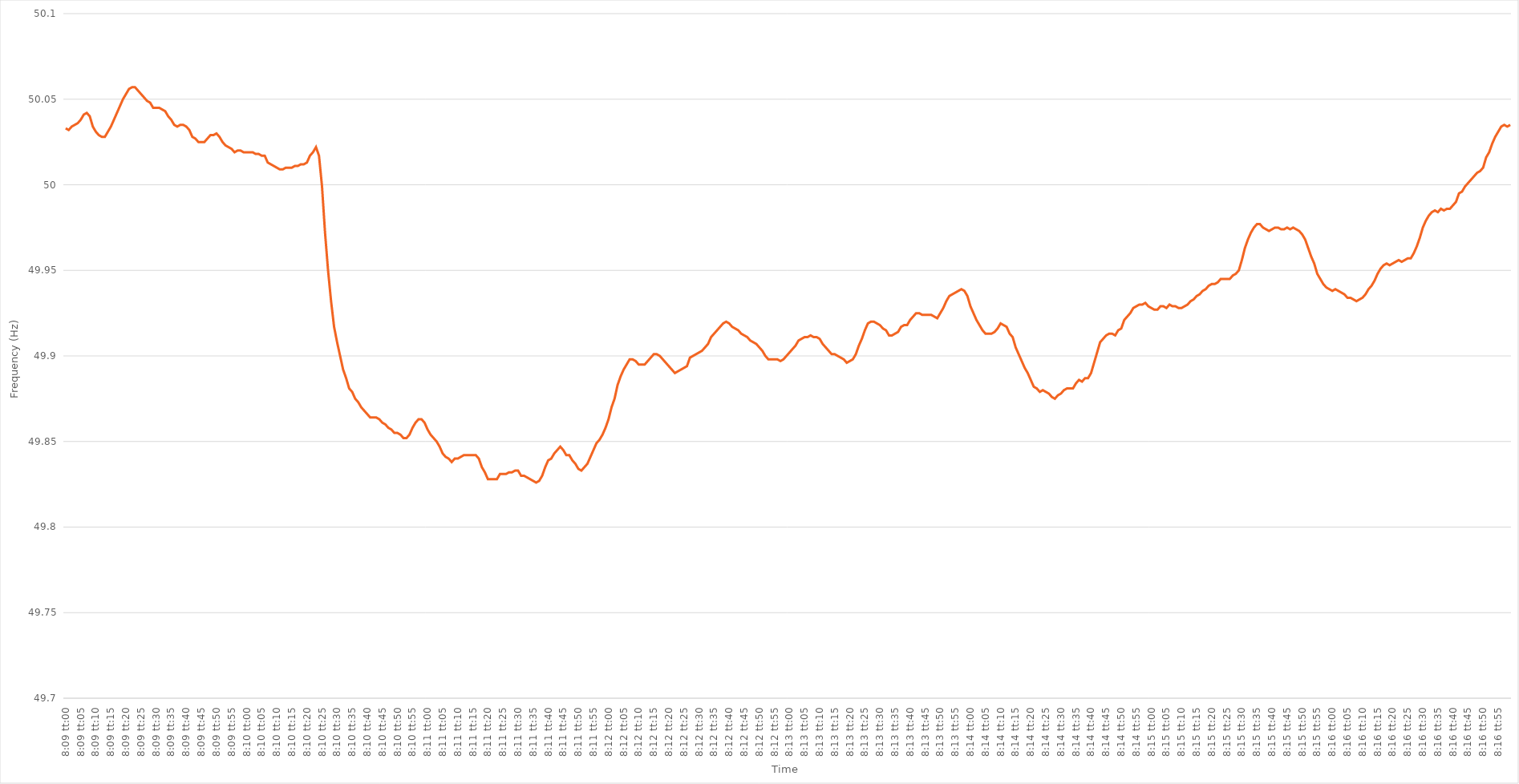
| Category | Series 0 |
|---|---|
| 0.33958333333333335 | 50.033 |
| 0.3395949074074074 | 50.032 |
| 0.3396064814814815 | 50.034 |
| 0.3396180555555555 | 50.035 |
| 0.33962962962962967 | 50.036 |
| 0.3396412037037037 | 50.038 |
| 0.3396527777777778 | 50.041 |
| 0.33966435185185184 | 50.042 |
| 0.33967592592592594 | 50.04 |
| 0.3396875 | 50.034 |
| 0.3396990740740741 | 50.031 |
| 0.33971064814814816 | 50.029 |
| 0.3397222222222222 | 50.028 |
| 0.3397337962962963 | 50.028 |
| 0.33974537037037034 | 50.031 |
| 0.33975694444444443 | 50.034 |
| 0.33976851851851847 | 50.038 |
| 0.3397800925925926 | 50.042 |
| 0.33979166666666666 | 50.046 |
| 0.33980324074074075 | 50.05 |
| 0.3398148148148148 | 50.053 |
| 0.3398263888888889 | 50.056 |
| 0.3398379629629629 | 50.057 |
| 0.3398495370370371 | 50.057 |
| 0.3398611111111111 | 50.055 |
| 0.3398726851851852 | 50.053 |
| 0.33988425925925925 | 50.051 |
| 0.33989583333333334 | 50.049 |
| 0.3399074074074074 | 50.048 |
| 0.33991898148148153 | 50.045 |
| 0.33993055555555557 | 50.045 |
| 0.33994212962962966 | 50.045 |
| 0.3399537037037037 | 50.044 |
| 0.3399652777777778 | 50.043 |
| 0.33997685185185184 | 50.04 |
| 0.3399884259259259 | 50.038 |
| 0.34 | 50.035 |
| 0.34001157407407406 | 50.034 |
| 0.34002314814814816 | 50.035 |
| 0.3400347222222222 | 50.035 |
| 0.3400462962962963 | 50.034 |
| 0.34005787037037033 | 50.032 |
| 0.3400694444444445 | 50.028 |
| 0.3400810185185185 | 50.027 |
| 0.3400925925925926 | 50.025 |
| 0.34010416666666665 | 50.025 |
| 0.34011574074074075 | 50.025 |
| 0.3401273148148148 | 50.027 |
| 0.34013888888888894 | 50.029 |
| 0.340150462962963 | 50.029 |
| 0.34016203703703707 | 50.03 |
| 0.3401736111111111 | 50.028 |
| 0.3401851851851852 | 50.025 |
| 0.34019675925925924 | 50.023 |
| 0.3402083333333333 | 50.022 |
| 0.34021990740740743 | 50.021 |
| 0.34023148148148147 | 50.019 |
| 0.34024305555555556 | 50.02 |
| 0.3402546296296296 | 50.02 |
| 0.3402662037037037 | 50.019 |
| 0.34027777777777773 | 50.019 |
| 0.3402893518518519 | 50.019 |
| 0.3403009259259259 | 50.019 |
| 0.3403125 | 50.018 |
| 0.34032407407407406 | 50.018 |
| 0.34033564814814815 | 50.017 |
| 0.3403472222222222 | 50.017 |
| 0.34035879629629634 | 50.013 |
| 0.3403703703703704 | 50.012 |
| 0.3403819444444445 | 50.011 |
| 0.3403935185185185 | 50.01 |
| 0.3404050925925926 | 50.009 |
| 0.34041666666666665 | 50.009 |
| 0.3404282407407408 | 50.01 |
| 0.34043981481481483 | 50.01 |
| 0.3404513888888889 | 50.01 |
| 0.34046296296296297 | 50.011 |
| 0.340474537037037 | 50.011 |
| 0.3404861111111111 | 50.012 |
| 0.34049768518518514 | 50.012 |
| 0.3405092592592593 | 50.013 |
| 0.34052083333333333 | 50.017 |
| 0.3405324074074074 | 50.019 |
| 0.34054398148148146 | 50.022 |
| 0.34055555555555556 | 50.017 |
| 0.3405671296296296 | 49.999 |
| 0.34057870370370374 | 49.972 |
| 0.3405902777777778 | 49.95 |
| 0.3406018518518519 | 49.932 |
| 0.3406134259259259 | 49.917 |
| 0.340625 | 49.908 |
| 0.34063657407407405 | 49.9 |
| 0.3406481481481482 | 49.892 |
| 0.34065972222222224 | 49.887 |
| 0.34067129629629633 | 49.881 |
| 0.34068287037037037 | 49.879 |
| 0.3406944444444444 | 49.875 |
| 0.3407060185185185 | 49.873 |
| 0.34071759259259254 | 49.87 |
| 0.3407291666666667 | 49.868 |
| 0.34074074074074073 | 49.866 |
| 0.3407523148148148 | 49.864 |
| 0.34076388888888887 | 49.864 |
| 0.34077546296296296 | 49.864 |
| 0.340787037037037 | 49.863 |
| 0.34079861111111115 | 49.861 |
| 0.3408101851851852 | 49.86 |
| 0.3408217592592593 | 49.858 |
| 0.3408333333333333 | 49.857 |
| 0.3408449074074074 | 49.855 |
| 0.34085648148148145 | 49.855 |
| 0.3408680555555556 | 49.854 |
| 0.34087962962962964 | 49.852 |
| 0.34089120370370374 | 49.852 |
| 0.3409027777777778 | 49.854 |
| 0.3409143518518518 | 49.858 |
| 0.3409259259259259 | 49.861 |
| 0.34093749999999995 | 49.863 |
| 0.3409490740740741 | 49.863 |
| 0.34096064814814814 | 49.861 |
| 0.34097222222222223 | 49.857 |
| 0.34098379629629627 | 49.854 |
| 0.34099537037037037 | 49.852 |
| 0.3410069444444444 | 49.85 |
| 0.34101851851851855 | 49.847 |
| 0.3410300925925926 | 49.843 |
| 0.3410416666666667 | 49.841 |
| 0.3410532407407407 | 49.84 |
| 0.3410648148148148 | 49.838 |
| 0.34107638888888886 | 49.84 |
| 0.341087962962963 | 49.84 |
| 0.34109953703703705 | 49.841 |
| 0.34111111111111114 | 49.842 |
| 0.3411226851851852 | 49.842 |
| 0.3411342592592593 | 49.842 |
| 0.3411458333333333 | 49.842 |
| 0.34115740740740735 | 49.842 |
| 0.3411689814814815 | 49.84 |
| 0.34118055555555554 | 49.835 |
| 0.34119212962962964 | 49.832 |
| 0.3412037037037037 | 49.828 |
| 0.34121527777777777 | 49.828 |
| 0.3412268518518518 | 49.828 |
| 0.34123842592592596 | 49.828 |
| 0.34125 | 49.831 |
| 0.3412615740740741 | 49.831 |
| 0.34127314814814813 | 49.831 |
| 0.3412847222222222 | 49.832 |
| 0.34129629629629626 | 49.832 |
| 0.3413078703703704 | 49.833 |
| 0.34131944444444445 | 49.833 |
| 0.34133101851851855 | 49.83 |
| 0.3413425925925926 | 49.83 |
| 0.3413541666666667 | 49.829 |
| 0.3413657407407407 | 49.828 |
| 0.34137731481481487 | 49.827 |
| 0.3413888888888889 | 49.826 |
| 0.34140046296296295 | 49.827 |
| 0.34141203703703704 | 49.83 |
| 0.3414236111111111 | 49.835 |
| 0.3414351851851852 | 49.839 |
| 0.3414467592592592 | 49.84 |
| 0.34145833333333336 | 49.843 |
| 0.3414699074074074 | 49.845 |
| 0.3414814814814815 | 49.847 |
| 0.34149305555555554 | 49.845 |
| 0.34150462962962963 | 49.842 |
| 0.34151620370370367 | 49.842 |
| 0.3415277777777778 | 49.839 |
| 0.34153935185185186 | 49.837 |
| 0.34155092592592595 | 49.834 |
| 0.3415625 | 49.833 |
| 0.3415740740740741 | 49.835 |
| 0.3415856481481481 | 49.837 |
| 0.3415972222222223 | 49.841 |
| 0.3416087962962963 | 49.845 |
| 0.34162037037037035 | 49.849 |
| 0.34163194444444445 | 49.851 |
| 0.3416435185185185 | 49.854 |
| 0.3416550925925926 | 49.858 |
| 0.3416666666666666 | 49.863 |
| 0.34167824074074077 | 49.87 |
| 0.3416898148148148 | 49.875 |
| 0.3417013888888889 | 49.883 |
| 0.34171296296296294 | 49.888 |
| 0.34172453703703703 | 49.892 |
| 0.3417361111111111 | 49.895 |
| 0.3417476851851852 | 49.898 |
| 0.34175925925925926 | 49.898 |
| 0.34177083333333336 | 49.897 |
| 0.3417824074074074 | 49.895 |
| 0.3417939814814815 | 49.895 |
| 0.34180555555555553 | 49.895 |
| 0.3418171296296297 | 49.897 |
| 0.3418287037037037 | 49.899 |
| 0.3418402777777778 | 49.901 |
| 0.34185185185185185 | 49.901 |
| 0.3418634259259259 | 49.9 |
| 0.341875 | 49.898 |
| 0.341886574074074 | 49.896 |
| 0.3418981481481482 | 49.894 |
| 0.3419097222222222 | 49.892 |
| 0.3419212962962963 | 49.89 |
| 0.34193287037037035 | 49.891 |
| 0.34194444444444444 | 49.892 |
| 0.3419560185185185 | 49.893 |
| 0.34196759259259263 | 49.894 |
| 0.34197916666666667 | 49.899 |
| 0.34199074074074076 | 49.9 |
| 0.3420023148148148 | 49.901 |
| 0.3420138888888889 | 49.902 |
| 0.34202546296296293 | 49.903 |
| 0.3420370370370371 | 49.905 |
| 0.3420486111111111 | 49.907 |
| 0.3420601851851852 | 49.911 |
| 0.34207175925925926 | 49.913 |
| 0.34208333333333335 | 49.915 |
| 0.3420949074074074 | 49.917 |
| 0.34210648148148143 | 49.919 |
| 0.3421180555555556 | 49.92 |
| 0.3421296296296296 | 49.919 |
| 0.3421412037037037 | 49.917 |
| 0.34215277777777775 | 49.916 |
| 0.34216435185185184 | 49.915 |
| 0.3421759259259259 | 49.913 |
| 0.34218750000000003 | 49.912 |
| 0.34219907407407407 | 49.911 |
| 0.34221064814814817 | 49.909 |
| 0.3422222222222222 | 49.908 |
| 0.3422337962962963 | 49.907 |
| 0.34224537037037034 | 49.905 |
| 0.3422569444444445 | 49.903 |
| 0.3422685185185185 | 49.9 |
| 0.3422800925925926 | 49.898 |
| 0.34229166666666666 | 49.898 |
| 0.34230324074074076 | 49.898 |
| 0.3423148148148148 | 49.898 |
| 0.34232638888888883 | 49.897 |
| 0.342337962962963 | 49.898 |
| 0.342349537037037 | 49.9 |
| 0.3423611111111111 | 49.902 |
| 0.34237268518518515 | 49.904 |
| 0.34238425925925925 | 49.906 |
| 0.3423958333333333 | 49.909 |
| 0.34240740740740744 | 49.91 |
| 0.3424189814814815 | 49.911 |
| 0.34243055555555557 | 49.911 |
| 0.3424421296296296 | 49.912 |
| 0.3424537037037037 | 49.911 |
| 0.34246527777777774 | 49.911 |
| 0.3424768518518519 | 49.91 |
| 0.34248842592592593 | 49.907 |
| 0.3425 | 49.905 |
| 0.34251157407407407 | 49.903 |
| 0.34252314814814816 | 49.901 |
| 0.3425347222222222 | 49.901 |
| 0.34254629629629635 | 49.9 |
| 0.3425578703703704 | 49.899 |
| 0.3425694444444445 | 49.898 |
| 0.3425810185185185 | 49.896 |
| 0.34259259259259256 | 49.897 |
| 0.34260416666666665 | 49.898 |
| 0.3426157407407407 | 49.901 |
| 0.34262731481481484 | 49.906 |
| 0.3426388888888889 | 49.91 |
| 0.342650462962963 | 49.915 |
| 0.342662037037037 | 49.919 |
| 0.3426736111111111 | 49.92 |
| 0.34268518518518515 | 49.92 |
| 0.3426967592592593 | 49.919 |
| 0.34270833333333334 | 49.918 |
| 0.34271990740740743 | 49.916 |
| 0.34273148148148147 | 49.915 |
| 0.34274305555555556 | 49.912 |
| 0.3427546296296296 | 49.912 |
| 0.34276620370370375 | 49.913 |
| 0.3427777777777778 | 49.914 |
| 0.3427893518518519 | 49.917 |
| 0.3428009259259259 | 49.918 |
| 0.34281249999999996 | 49.918 |
| 0.34282407407407406 | 49.921 |
| 0.3428356481481481 | 49.923 |
| 0.34284722222222225 | 49.925 |
| 0.3428587962962963 | 49.925 |
| 0.3428703703703704 | 49.924 |
| 0.3428819444444444 | 49.924 |
| 0.3428935185185185 | 49.924 |
| 0.34290509259259255 | 49.924 |
| 0.3429166666666667 | 49.923 |
| 0.34292824074074074 | 49.922 |
| 0.34293981481481484 | 49.925 |
| 0.3429513888888889 | 49.928 |
| 0.34296296296296297 | 49.932 |
| 0.342974537037037 | 49.935 |
| 0.34298611111111116 | 49.936 |
| 0.3429976851851852 | 49.937 |
| 0.3430092592592593 | 49.938 |
| 0.34302083333333333 | 49.939 |
| 0.3430324074074074 | 49.938 |
| 0.34304398148148146 | 49.935 |
| 0.3430555555555555 | 49.929 |
| 0.34306712962962965 | 49.925 |
| 0.3430787037037037 | 49.921 |
| 0.3430902777777778 | 49.918 |
| 0.3431018518518518 | 49.915 |
| 0.3431134259259259 | 49.913 |
| 0.34312499999999996 | 49.913 |
| 0.3431365740740741 | 49.913 |
| 0.34314814814814815 | 49.914 |
| 0.34315972222222224 | 49.916 |
| 0.3431712962962963 | 49.919 |
| 0.3431828703703704 | 49.918 |
| 0.3431944444444444 | 49.917 |
| 0.34320601851851856 | 49.913 |
| 0.3432175925925926 | 49.911 |
| 0.3432291666666667 | 49.905 |
| 0.34324074074074074 | 49.901 |
| 0.34325231481481483 | 49.897 |
| 0.34326388888888887 | 49.893 |
| 0.343275462962963 | 49.89 |
| 0.34328703703703706 | 49.886 |
| 0.3432986111111111 | 49.882 |
| 0.3433101851851852 | 49.881 |
| 0.34332175925925923 | 49.879 |
| 0.3433333333333333 | 49.88 |
| 0.34334490740740736 | 49.879 |
| 0.3433564814814815 | 49.878 |
| 0.34336805555555555 | 49.876 |
| 0.34337962962962965 | 49.875 |
| 0.3433912037037037 | 49.877 |
| 0.3434027777777778 | 49.878 |
| 0.3434143518518518 | 49.88 |
| 0.34342592592592597 | 49.881 |
| 0.3434375 | 49.881 |
| 0.3434490740740741 | 49.881 |
| 0.34346064814814814 | 49.884 |
| 0.34347222222222223 | 49.886 |
| 0.3434837962962963 | 49.885 |
| 0.3434953703703704 | 49.887 |
| 0.34350694444444446 | 49.887 |
| 0.3435185185185185 | 49.89 |
| 0.3435300925925926 | 49.896 |
| 0.34354166666666663 | 49.902 |
| 0.34355324074074073 | 49.908 |
| 0.34356481481481477 | 49.91 |
| 0.3435763888888889 | 49.912 |
| 0.34358796296296296 | 49.913 |
| 0.34359953703703705 | 49.913 |
| 0.3436111111111111 | 49.912 |
| 0.3436226851851852 | 49.915 |
| 0.3436342592592592 | 49.916 |
| 0.3436458333333334 | 49.921 |
| 0.3436574074074074 | 49.923 |
| 0.3436689814814815 | 49.925 |
| 0.34368055555555554 | 49.928 |
| 0.34369212962962964 | 49.929 |
| 0.3437037037037037 | 49.93 |
| 0.34371527777777783 | 49.93 |
| 0.34372685185185187 | 49.931 |
| 0.34373842592592596 | 49.929 |
| 0.34375 | 49.928 |
| 0.34376157407407404 | 49.927 |
| 0.34377314814814813 | 49.927 |
| 0.34378472222222217 | 49.929 |
| 0.3437962962962963 | 49.929 |
| 0.34380787037037036 | 49.928 |
| 0.34381944444444446 | 49.93 |
| 0.3438310185185185 | 49.929 |
| 0.3438425925925926 | 49.929 |
| 0.3438541666666666 | 49.928 |
| 0.3438657407407408 | 49.928 |
| 0.3438773148148148 | 49.929 |
| 0.3438888888888889 | 49.93 |
| 0.34390046296296295 | 49.932 |
| 0.34391203703703704 | 49.933 |
| 0.3439236111111111 | 49.935 |
| 0.34393518518518523 | 49.936 |
| 0.34394675925925927 | 49.938 |
| 0.34395833333333337 | 49.939 |
| 0.3439699074074074 | 49.941 |
| 0.3439814814814815 | 49.942 |
| 0.34399305555555554 | 49.942 |
| 0.3440046296296296 | 49.943 |
| 0.3440162037037037 | 49.945 |
| 0.34402777777777777 | 49.945 |
| 0.34403935185185186 | 49.945 |
| 0.3440509259259259 | 49.945 |
| 0.3440625 | 49.947 |
| 0.34407407407407403 | 49.948 |
| 0.3440856481481482 | 49.95 |
| 0.3440972222222222 | 49.956 |
| 0.3441087962962963 | 49.963 |
| 0.34412037037037035 | 49.968 |
| 0.34413194444444445 | 49.972 |
| 0.3441435185185185 | 49.975 |
| 0.34415509259259264 | 49.977 |
| 0.3441666666666667 | 49.977 |
| 0.34417824074074077 | 49.975 |
| 0.3441898148148148 | 49.974 |
| 0.3442013888888889 | 49.973 |
| 0.34421296296296294 | 49.974 |
| 0.344224537037037 | 49.975 |
| 0.34423611111111113 | 49.975 |
| 0.34424768518518517 | 49.974 |
| 0.34425925925925926 | 49.974 |
| 0.3442708333333333 | 49.975 |
| 0.3442824074074074 | 49.974 |
| 0.34429398148148144 | 49.975 |
| 0.3443055555555556 | 49.974 |
| 0.3443171296296296 | 49.973 |
| 0.3443287037037037 | 49.971 |
| 0.34434027777777776 | 49.968 |
| 0.34435185185185185 | 49.963 |
| 0.3443634259259259 | 49.958 |
| 0.34437500000000004 | 49.954 |
| 0.3443865740740741 | 49.948 |
| 0.3443981481481482 | 49.945 |
| 0.3444097222222222 | 49.942 |
| 0.3444212962962963 | 49.94 |
| 0.34443287037037035 | 49.939 |
| 0.3444444444444445 | 49.938 |
| 0.34445601851851854 | 49.939 |
| 0.34446759259259263 | 49.938 |
| 0.34447916666666667 | 49.937 |
| 0.3444907407407407 | 49.936 |
| 0.3445023148148148 | 49.934 |
| 0.34451388888888884 | 49.934 |
| 0.344525462962963 | 49.933 |
| 0.34453703703703703 | 49.932 |
| 0.3445486111111111 | 49.933 |
| 0.34456018518518516 | 49.934 |
| 0.34457175925925926 | 49.936 |
| 0.3445833333333333 | 49.939 |
| 0.34459490740740745 | 49.941 |
| 0.3446064814814815 | 49.944 |
| 0.3446180555555556 | 49.948 |
| 0.3446296296296296 | 49.951 |
| 0.3446412037037037 | 49.953 |
| 0.34465277777777775 | 49.954 |
| 0.3446643518518519 | 49.953 |
| 0.34467592592592594 | 49.954 |
| 0.34468750000000004 | 49.955 |
| 0.3446990740740741 | 49.956 |
| 0.3447106481481481 | 49.955 |
| 0.3447222222222222 | 49.956 |
| 0.34473379629629625 | 49.957 |
| 0.3447453703703704 | 49.957 |
| 0.34475694444444444 | 49.96 |
| 0.34476851851851853 | 49.964 |
| 0.34478009259259257 | 49.969 |
| 0.34479166666666666 | 49.975 |
| 0.3448032407407407 | 49.979 |
| 0.34481481481481485 | 49.982 |
| 0.3448263888888889 | 49.984 |
| 0.344837962962963 | 49.985 |
| 0.344849537037037 | 49.984 |
| 0.3448611111111111 | 49.986 |
| 0.34487268518518516 | 49.985 |
| 0.3448842592592593 | 49.986 |
| 0.34489583333333335 | 49.986 |
| 0.34490740740740744 | 49.988 |
| 0.3449189814814815 | 49.99 |
| 0.3449305555555555 | 49.995 |
| 0.3449421296296296 | 49.996 |
| 0.34495370370370365 | 49.999 |
| 0.3449652777777778 | 50.001 |
| 0.34497685185185184 | 50.003 |
| 0.34498842592592593 | 50.005 |
| 0.345 | 50.007 |
| 0.34501157407407407 | 50.008 |
| 0.3450231481481481 | 50.01 |
| 0.34503472222222226 | 50.016 |
| 0.3450462962962963 | 50.019 |
| 0.3450578703703704 | 50.024 |
| 0.34506944444444443 | 50.028 |
| 0.3450810185185185 | 50.031 |
| 0.34509259259259256 | 50.034 |
| 0.3451041666666667 | 50.035 |
| 0.34511574074074075 | 50.034 |
| 0.34512731481481485 | 50.035 |